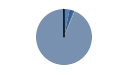
| Category | Series 0 |
|---|---|
| ARRASTRE | 88 |
| CERCO | 67 |
| PALANGRE | 12 |
| REDES DE ENMALLE | 4 |
| ARTES FIJAS | 1 |
| ARTES MENORES | 2583 |
| SIN TIPO ASIGNADO | 4 |